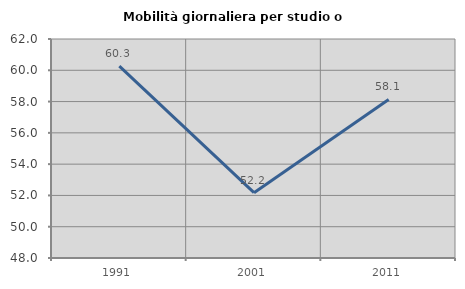
| Category | Mobilità giornaliera per studio o lavoro |
|---|---|
| 1991.0 | 60.26 |
| 2001.0 | 52.174 |
| 2011.0 | 58.135 |